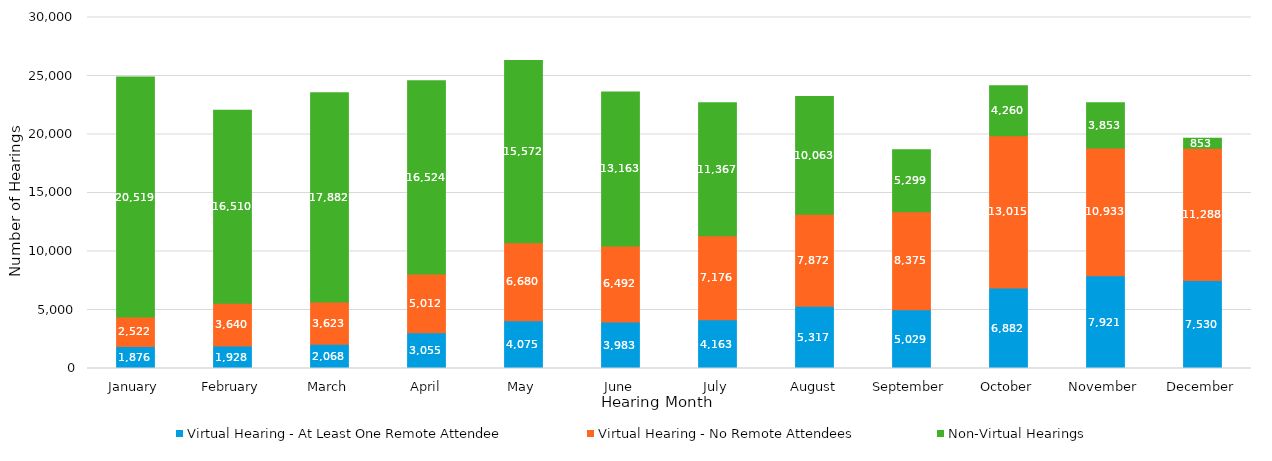
| Category | Virtual Hearing - At Least One Remote Attendee | Virtual Hearing - No Remote Attendees | Non-Virtual Hearings |
|---|---|---|---|
| January | 1876 | 2522 | 20519 |
| February | 1928 | 3640 | 16510 |
| March | 2068 | 3623 | 17882 |
| April | 3055 | 5012 | 16524 |
| May | 4075 | 6680 | 15572 |
| June | 3983 | 6492 | 13163 |
| July | 4163 | 7176 | 11367 |
| August | 5317 | 7872 | 10063 |
| September | 5029 | 8375 | 5299 |
| October | 6882 | 13015 | 4260 |
| November | 7921 | 10933 | 3853 |
| December | 7530 | 11288 | 853 |